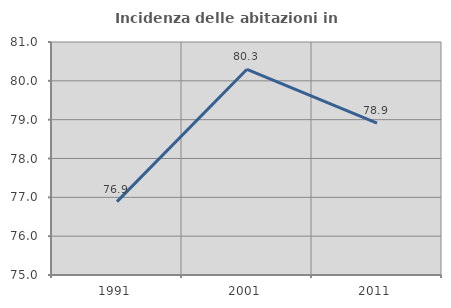
| Category | Incidenza delle abitazioni in proprietà  |
|---|---|
| 1991.0 | 76.891 |
| 2001.0 | 80.297 |
| 2011.0 | 78.909 |